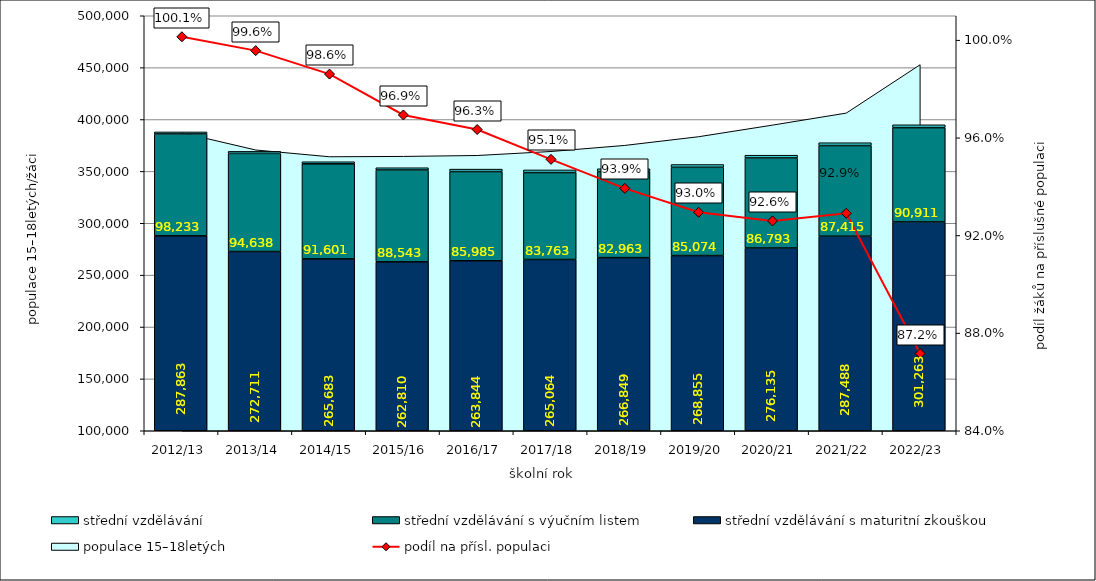
| Category | střední vzdělávání s maturitní zkouškou | střední vzdělávání s výučním listem | střední vzdělávání |
|---|---|---|---|
| 2012/13 | 287863 | 98233 | 1940 |
| 2013/14 | 272711 | 94638 | 1933 |
| 2014/15 | 265683 | 91601 | 2000 |
| 2015/16 | 262810 | 88543 | 2162 |
| 2016/17 | 263844 | 85985 | 2369 |
| 2017/18 | 265064 | 83763 | 2579 |
| 2018/19 | 266849 | 82963 | 2690 |
| 2019/20 | 268855 | 85074 | 2697 |
| 2020/21 | 276135 | 86793 | 2689 |
| 2021/22 | 287488 | 87415 | 2725 |
| 2022/23 | 301263 | 90911 | 2733 |